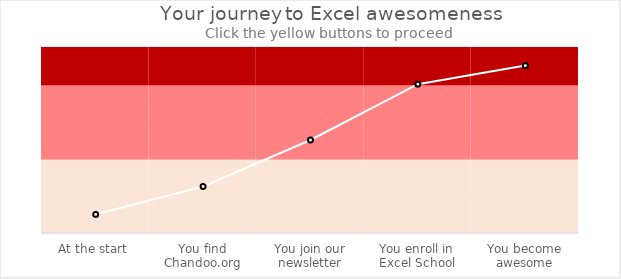
| Category | Below Average | Average | Awesome |
|---|---|---|---|
| At the start | 0.4 | 0.4 | 0.2 |
| You find Chandoo.org | 0.4 | 0.4 | 0.2 |
| You join our newsletter | 0.4 | 0.4 | 0.2 |
| You enroll in Excel School | 0.4 | 0.4 | 0.2 |
| You become awesome | 0.4 | 0.4 | 0.2 |